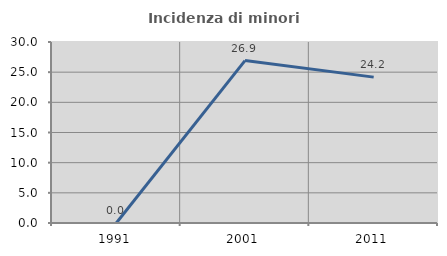
| Category | Incidenza di minori stranieri |
|---|---|
| 1991.0 | 0 |
| 2001.0 | 26.923 |
| 2011.0 | 24.179 |